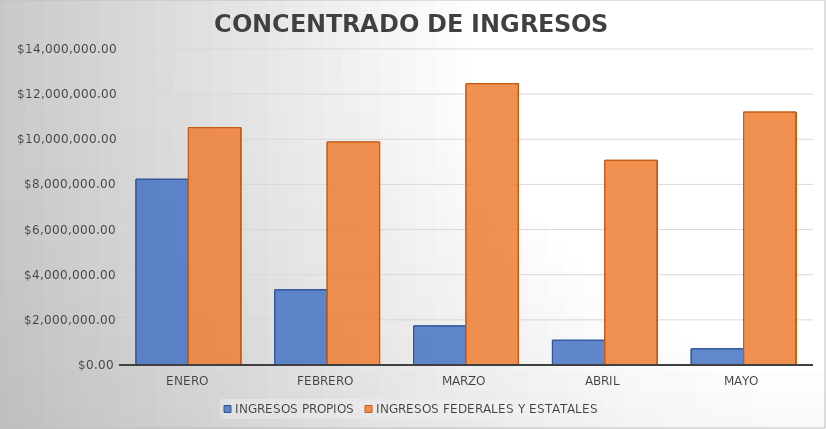
| Category | INGRESOS PROPIOS | INGRESOS FEDERALES Y ESTATALES |
|---|---|---|
| ENERO | 8226699.11 | 10515578.27 |
| FEBRERO | 3328101.99 | 9877514.58 |
| MARZO | 1728227.66 | 12462251.69 |
| ABRIL | 1094128.94 | 9067246.66 |
| MAYO | 714023.94 | 11202039.88 |